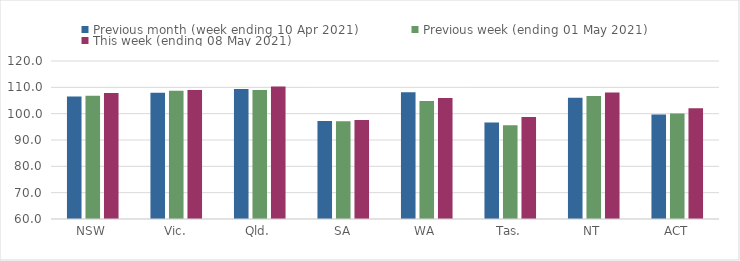
| Category | Previous month (week ending 10 Apr 2021) | Previous week (ending 01 May 2021) | This week (ending 08 May 2021) |
|---|---|---|---|
| NSW | 106.55 | 106.82 | 107.86 |
| Vic. | 107.99 | 108.69 | 109.01 |
| Qld. | 109.38 | 109.02 | 110.33 |
| SA | 97.24 | 97.16 | 97.63 |
| WA | 108.13 | 104.78 | 105.92 |
| Tas. | 96.67 | 95.61 | 98.75 |
| NT | 106.05 | 106.75 | 108.07 |
| ACT | 99.66 | 100.05 | 102.01 |